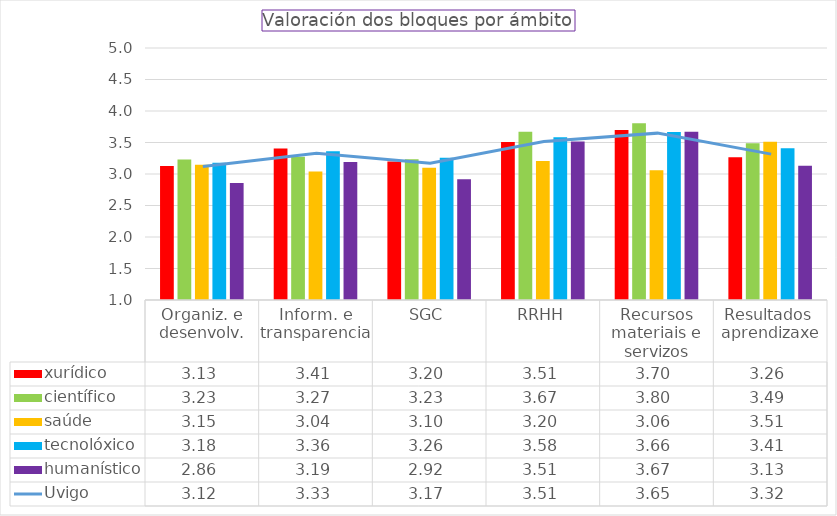
| Category | xurídico | científico | saúde | tecnolóxico | humanístico |
|---|---|---|---|---|---|
| Organiz. e desenvolv. | 3.128 | 3.229 | 3.147 | 3.18 | 2.859 |
| Inform. e transparencia | 3.406 | 3.272 | 3.038 | 3.359 | 3.192 |
| SGC | 3.197 | 3.233 | 3.1 | 3.258 | 2.917 |
| RRHH | 3.51 | 3.669 | 3.205 | 3.583 | 3.514 |
| Recursos materiais e servizos | 3.698 | 3.805 | 3.061 | 3.665 | 3.672 |
| Resultados  aprendizaxe | 3.265 | 3.49 | 3.512 | 3.41 | 3.131 |